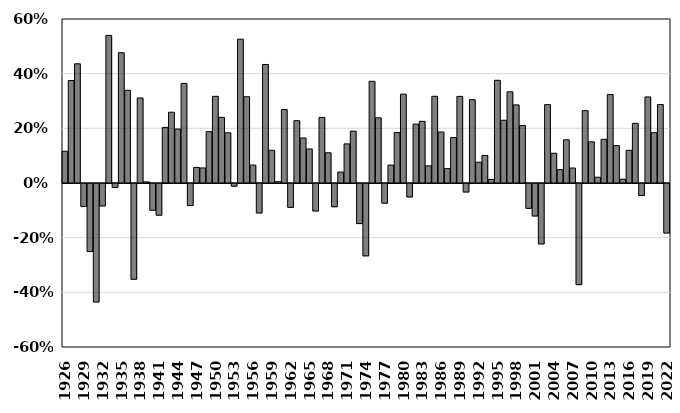
| Category | Series 1 |
|---|---|
| 1926.0 | 0.116 |
| 1927.0 | 0.375 |
| 1928.0 | 0.436 |
| 1929.0 | -0.084 |
| 1930.0 | -0.249 |
| 1931.0 | -0.433 |
| 1932.0 | -0.082 |
| 1933.0 | 0.54 |
| 1934.0 | -0.014 |
| 1935.0 | 0.477 |
| 1936.0 | 0.339 |
| 1937.0 | -0.35 |
| 1938.0 | 0.311 |
| 1939.0 | 0.004 |
| 1940.0 | -0.098 |
| 1941.0 | -0.116 |
| 1942.0 | 0.203 |
| 1943.0 | 0.259 |
| 1944.0 | 0.198 |
| 1945.0 | 0.364 |
| 1946.0 | -0.081 |
| 1947.0 | 0.057 |
| 1948.0 | 0.055 |
| 1949.0 | 0.188 |
| 1950.0 | 0.317 |
| 1951.0 | 0.24 |
| 1952.0 | 0.184 |
| 1953.0 | -0.01 |
| 1954.0 | 0.526 |
| 1955.0 | 0.316 |
| 1956.0 | 0.066 |
| 1957.0 | -0.108 |
| 1958.0 | 0.434 |
| 1959.0 | 0.12 |
| 1960.0 | 0.005 |
| 1961.0 | 0.269 |
| 1962.0 | -0.087 |
| 1963.0 | 0.228 |
| 1964.0 | 0.165 |
| 1965.0 | 0.124 |
| 1966.0 | -0.101 |
| 1967.0 | 0.24 |
| 1968.0 | 0.111 |
| 1969.0 | -0.085 |
| 1970.0 | 0.04 |
| 1971.0 | 0.143 |
| 1972.0 | 0.19 |
| 1973.0 | -0.147 |
| 1974.0 | -0.265 |
| 1975.0 | 0.372 |
| 1976.0 | 0.238 |
| 1977.0 | -0.072 |
| 1978.0 | 0.066 |
| 1979.0 | 0.184 |
| 1980.0 | 0.325 |
| 1981.0 | -0.049 |
| 1982.0 | 0.216 |
| 1983.0 | 0.226 |
| 1984.0 | 0.063 |
| 1985.0 | 0.317 |
| 1986.0 | 0.187 |
| 1987.0 | 0.052 |
| 1988.0 | 0.166 |
| 1989.0 | 0.317 |
| 1990.0 | -0.031 |
| 1991.0 | 0.305 |
| 1992.0 | 0.076 |
| 1993.0 | 0.101 |
| 1994.0 | 0.013 |
| 1995.0 | 0.376 |
| 1996.0 | 0.23 |
| 1997.0 | 0.334 |
| 1998.0 | 0.286 |
| 1999.0 | 0.21 |
| 2000.0 | -0.091 |
| 2001.0 | -0.119 |
| 2002.0 | -0.221 |
| 2003.0 | 0.287 |
| 2004.0 | 0.109 |
| 2005.0 | 0.049 |
| 2006.0 | 0.158 |
| 2007.0 | 0.055 |
| 2008.0 | -0.37 |
| 2009.0 | 0.265 |
| 2010.0 | 0.151 |
| 2011.0 | 0.021 |
| 2012.0 | 0.16 |
| 2013.0 | 0.324 |
| 2014.0 | 0.137 |
| 2015.0 | 0.014 |
| 2016.0 | 0.12 |
| 2017.0 | 0.218 |
| 2018.0 | -0.044 |
| 2019.0 | 0.315 |
| 2020.0 | 0.184 |
| 2021.0 | 0.287 |
| 2022.0 | -0.181 |